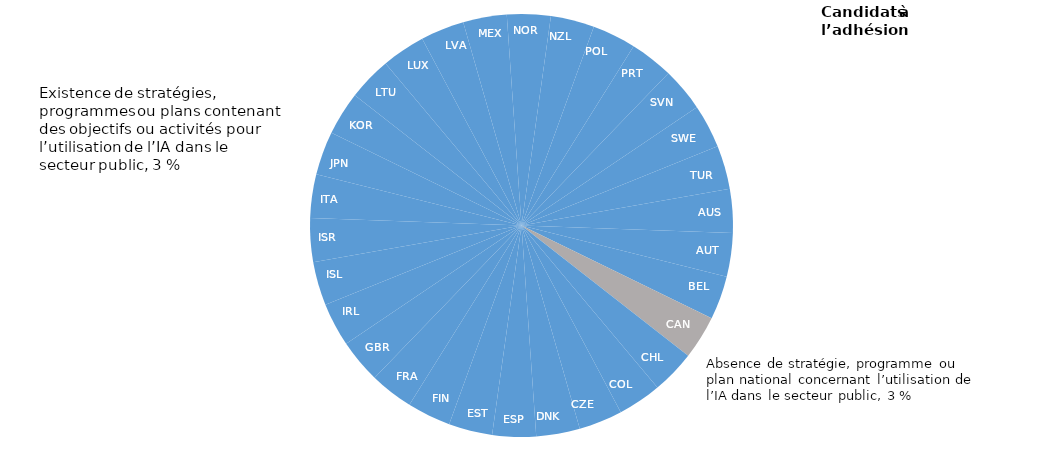
| Category | Series 0 |
|---|---|
| AUS | 0.033 |
| AUT | 0.033 |
| BEL | 0.033 |
| CAN | 0.033 |
| CHL | 0.033 |
| COL | 0.033 |
| CZE | 0.033 |
| DNK | 0.033 |
| ESP | 0.033 |
| EST | 0.033 |
| FIN | 0.033 |
| FRA | 0.033 |
| GBR | 0.033 |
| IRL | 0.033 |
| ISL | 0.033 |
| ISR | 0.033 |
| ITA | 0.033 |
| JPN | 0.033 |
| KOR | 0.033 |
| LTU | 0.033 |
| LUX | 0.033 |
| LVA | 0.033 |
| MEX | 0.033 |
| NOR | 0.033 |
| NZL | 0.033 |
| POL | 0.033 |
| PRT | 0.033 |
| SVN | 0.033 |
| SWE | 0.033 |
| TUR | 0.033 |